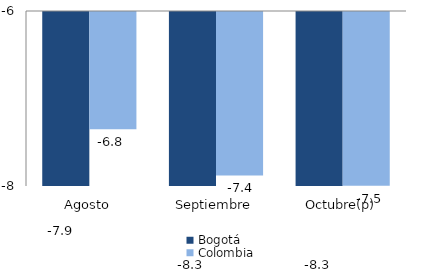
| Category | Bogotá | Colombia |
|---|---|---|
| Agosto | -7.855 | -6.84 |
| Septiembre | -8.27 | -7.367 |
| Octubre(p) | -8.325 | -7.485 |